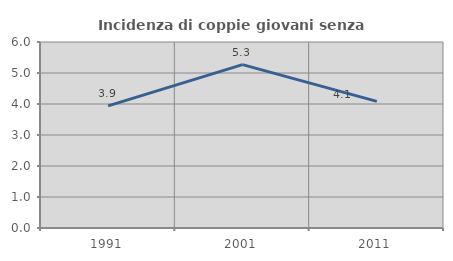
| Category | Incidenza di coppie giovani senza figli |
|---|---|
| 1991.0 | 3.938 |
| 2001.0 | 5.271 |
| 2011.0 | 4.084 |